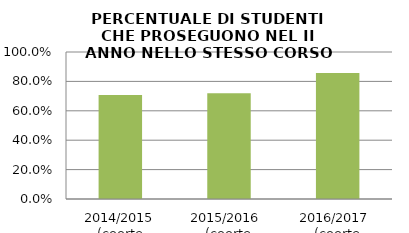
| Category | 2014/2015 (coorte 2013/14) 2015/2016  (coorte 2014/15) 2016/2017  (coorte 2015/16) |
|---|---|
| 2014/2015 (coorte 2013/14) | 0.707 |
| 2015/2016  (coorte 2014/15) | 0.72 |
| 2016/2017  (coorte 2015/16) | 0.857 |